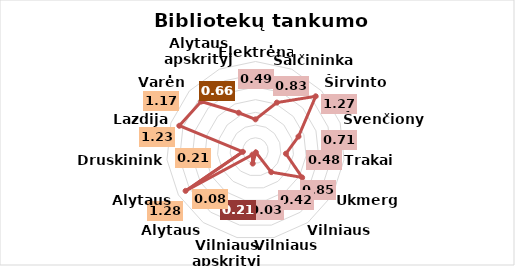
| Category | Series 0 |
|---|---|
| Elektrėnai | 0.49 |
| Šalčininkai | 0.825 |
| Širvintos | 1.274 |
| Švenčionys | 0.711 |
| Trakai | 0.481 |
| Ukmergė | 0.847 |
| Vilniaus r. | 0.421 |
| Vilniaus m. | 0.03 |
| Vilniaus apskrityje | 0.21 |
| Alytaus m. | 0.08 |
| Alytaus r. | 1.27 |
| Druskininkai | 0.2 |
| Lazdijai | 1.26 |
| Varėna | 1.15 |
| Alytaus apskrityje | 0.65 |